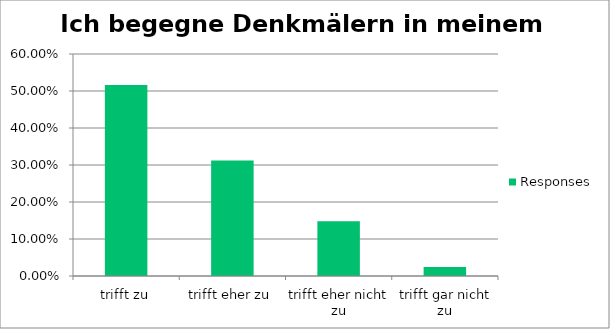
| Category | Responses |
|---|---|
| trifft zu | 0.516 |
| trifft eher zu | 0.312 |
| trifft eher nicht zu | 0.148 |
| trifft gar nicht zu | 0.024 |